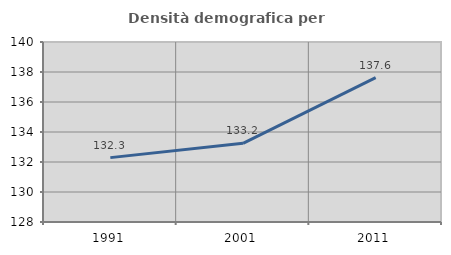
| Category | Densità demografica |
|---|---|
| 1991.0 | 132.292 |
| 2001.0 | 133.245 |
| 2011.0 | 137.626 |